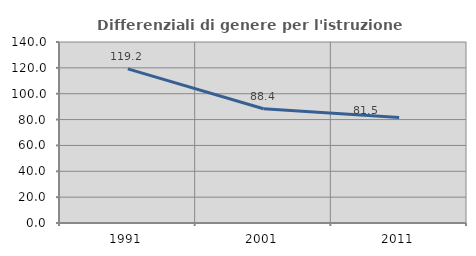
| Category | Differenziali di genere per l'istruzione superiore |
|---|---|
| 1991.0 | 119.244 |
| 2001.0 | 88.414 |
| 2011.0 | 81.536 |